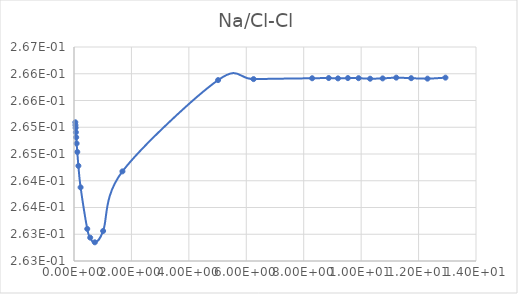
| Category | Series 0 |
|---|---|
| 0.045799 | 0.265 |
| 0.050887 | 0.265 |
| 0.057259 | 0.265 |
| 0.065457 | 0.265 |
| 0.076371 | 0.265 |
| 0.091686 | 0.265 |
| 0.11463 | 0.265 |
| 0.15299 | 0.264 |
| 0.22971 | 0.264 |
| 0.46165 | 0.263 |
| 0.56409 | 0.263 |
| 0.72494 | 0.263 |
| 1.0141 | 0.263 |
| 1.6871 | 0.264 |
| 5.0184 | 0.266 |
| 6.2531 | 0.266 |
| 8.2936 | 0.266 |
| 8.8726 | 0.266 |
| 9.1936 | 0.266 |
| 9.5386 | 0.266 |
| 9.9106 | 0.266 |
| 10.313 | 0.266 |
| 10.749 | 0.266 |
| 11.223 | 0.266 |
| 11.742 | 0.266 |
| 12.311 | 0.266 |
| 12.937 | 0.266 |